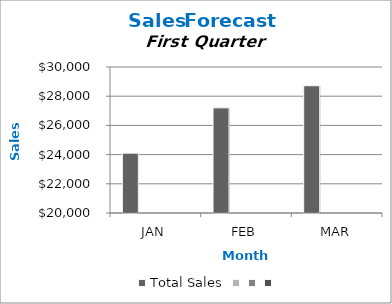
| Category | Total Sales | Series 1 | Series 2 | Series 3 |
|---|---|---|---|---|
| JAN | 24100 |  |  |  |
| FEB | 27202 |  |  |  |
| MAR | 28716 |  |  |  |